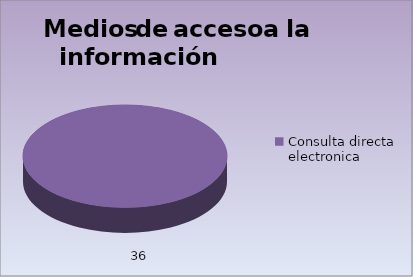
| Category | Series 0 |
|---|---|
| Consulta directa electronica | 36 |